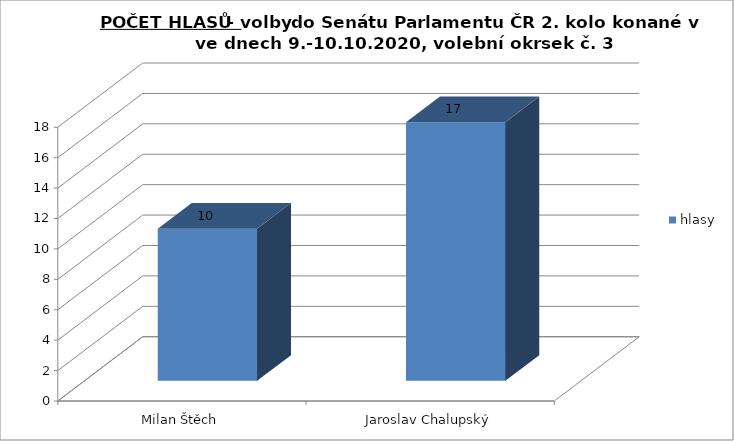
| Category | hlasy |
|---|---|
| Milan Štěch | 10 |
| Jaroslav Chalupský | 17 |